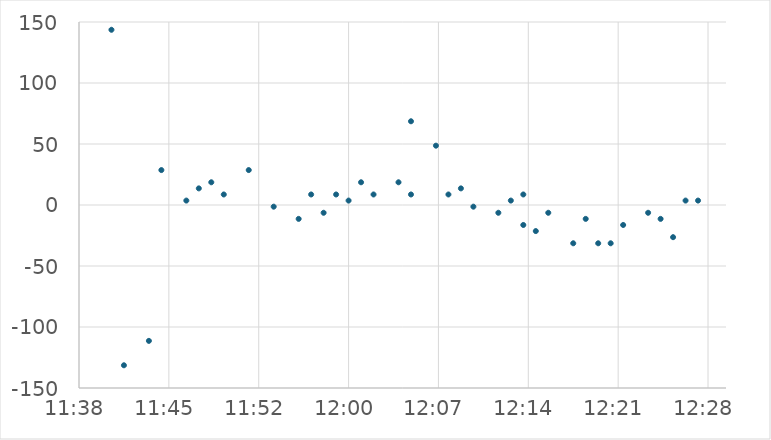
| Category | Series 0 |
|---|---|
| 0.48680555555555555 | 143.625 |
| 0.4875 | -131.375 |
| 0.4888888888888889 | -111.375 |
| 0.4895833333333333 | 28.625 |
| 0.4909722222222222 | 3.625 |
| 0.49166666666666664 | 13.625 |
| 0.49236111111111114 | 18.625 |
| 0.4930555555555556 | 8.625 |
| 0.49444444444444446 | 28.625 |
| 0.49583333333333335 | -1.375 |
| 0.49722222222222223 | -11.375 |
| 0.4979166666666667 | 8.625 |
| 0.4986111111111111 | -6.375 |
| 0.49930555555555556 | 8.625 |
| 0.5 | 3.625 |
| 0.5006944444444444 | 18.625 |
| 0.5013888888888889 | 8.625 |
| 0.5027777777777778 | 18.625 |
| 0.5034722222222222 | 8.625 |
| 0.5034722222222222 | 68.625 |
| 0.5048611111111111 | 48.625 |
| 0.5055555555555555 | 8.625 |
| 0.50625 | 13.625 |
| 0.5069444444444444 | -1.375 |
| 0.5083333333333333 | -6.375 |
| 0.5090277777777777 | 3.625 |
| 0.5097222222222222 | 8.625 |
| 0.5097222222222222 | -16.375 |
| 0.5104166666666666 | -21.375 |
| 0.5111111111111111 | -6.375 |
| 0.5125 | -31.375 |
| 0.5131944444444444 | -11.375 |
| 0.5138888888888888 | -31.375 |
| 0.5145833333333333 | -31.375 |
| 0.5152777777777777 | -16.375 |
| 0.5166666666666667 | -6.375 |
| 0.5173611111111112 | -11.375 |
| 0.5180555555555556 | -26.375 |
| 0.51875 | 3.625 |
| 0.5194444444444445 | 3.625 |